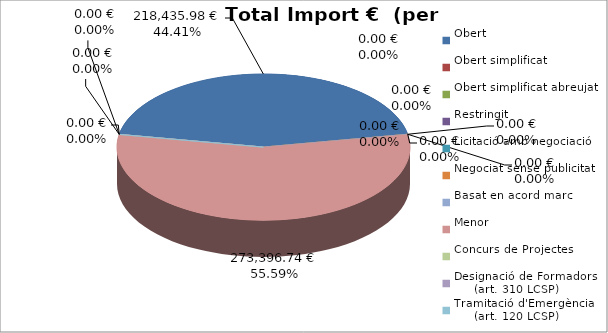
| Category | Total preu
(amb IVA) |
|---|---|
| Obert | 218435.98 |
| Obert simplificat | 0 |
| Obert simplificat abreujat | 0 |
| Restringit | 0 |
| Licitació amb negociació | 0 |
| Negociat sense publicitat | 0 |
| Basat en acord marc | 0 |
| Menor | 273396.74 |
| Concurs de Projectes | 0 |
| Designació de Formadors
     (art. 310 LCSP) | 0 |
| Tramitació d'Emergència
     (art. 120 LCSP) | 0 |